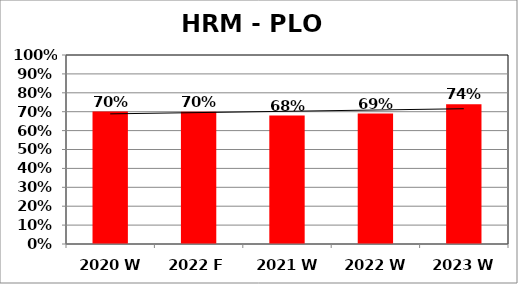
| Category | Series 0 |
|---|---|
| 2020 W | 0.701 |
| 2022 F | 0.7 |
| 2021 W | 0.68 |
| 2022 W | 0.69 |
| 2023 W | 0.74 |